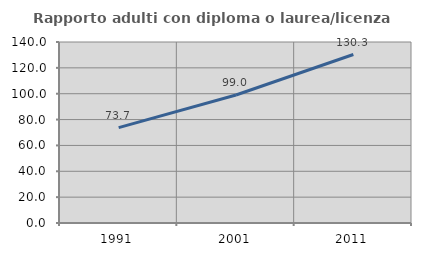
| Category | Rapporto adulti con diploma o laurea/licenza media  |
|---|---|
| 1991.0 | 73.736 |
| 2001.0 | 99.014 |
| 2011.0 | 130.311 |